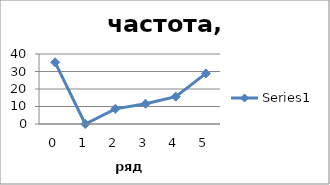
| Category | Series 0 |
|---|---|
| 0.0 | 35.26 |
| 1.0 | 0 |
| 2.0 | 8.671 |
| 3.0 | 11.561 |
| 4.0 | 15.607 |
| 5.0 | 28.902 |